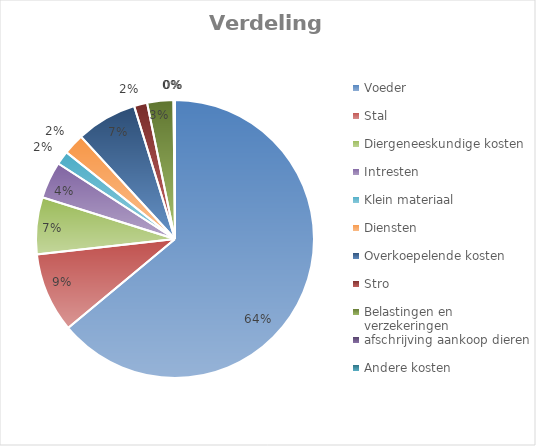
| Category | Series 1 | Series 0 |
|---|---|---|
| Voeder | 12074.032 | 12074.032 |
| Stal | 1750 | 1750 |
| Diergeneeskundige kosten | 1250 | 1250 |
| Intresten | 810 | 810 |
| Klein materiaal  | 300 | 300 |
| Diensten | 462.368 | 462.368 |
| Overkoepelende kosten | 1336.3 | 1336.3 |
| Stro | 288 | 288 |
| Belastingen en verzekeringen | 575 | 575 |
| afschrijving aankoop dieren | 33.333 | 33.333 |
| Andere kosten | 0 | 0 |